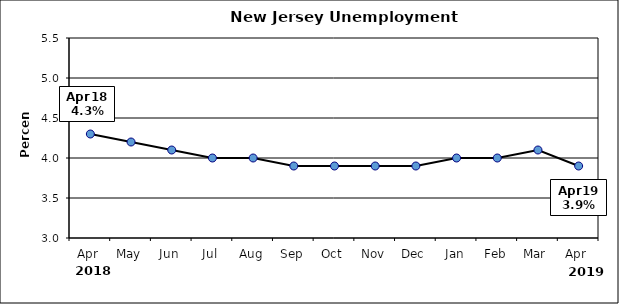
| Category | Series 0 |
|---|---|
| Apr | 4.3 |
| May | 4.2 |
| Jun | 4.1 |
| Jul | 4 |
| Aug | 4 |
| Sep | 3.9 |
| Oct | 3.9 |
| Nov | 3.9 |
| Dec | 3.9 |
| Jan | 4 |
| Feb | 4 |
| Mar | 4.1 |
| Apr | 3.9 |